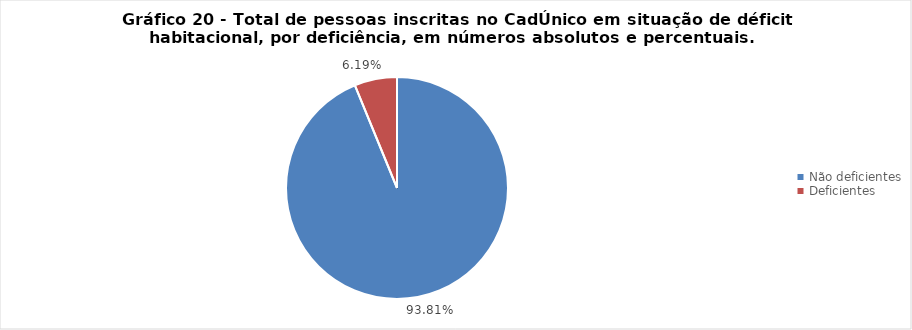
| Category | Series 0 |
|---|---|
| Não deficientes | 0.938 |
| Deficientes | 0.062 |